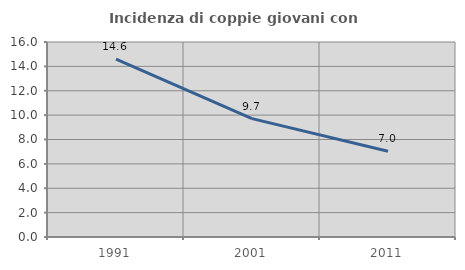
| Category | Incidenza di coppie giovani con figli |
|---|---|
| 1991.0 | 14.591 |
| 2001.0 | 9.712 |
| 2011.0 | 7.036 |